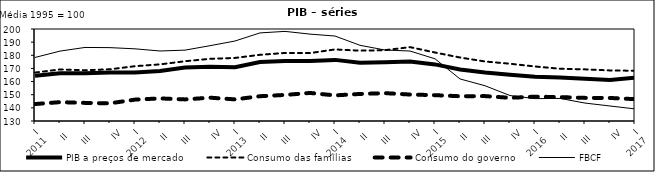
| Category | PIB a preços de mercado | Consumo das famílias | Consumo do governo | FBCF |
|---|---|---|---|---|
| I
2011 | 164.361 | 166.853 | 142.905 | 178.343 |
| II | 166.376 | 169.223 | 144.342 | 183.179 |
| III  | 166.392 | 168.626 | 143.777 | 185.966 |
| IV | 166.932 | 169.352 | 143.451 | 185.827 |
| I
2012 | 166.876 | 171.703 | 146.265 | 184.912 |
| II | 168.067 | 173.083 | 147.182 | 183.265 |
| III  | 170.736 | 175.463 | 146.426 | 183.92 |
| IV | 171.184 | 177.309 | 147.738 | 187.298 |
| I
2013 | 170.969 | 177.988 | 146.456 | 190.869 |
| II | 174.894 | 180.367 | 148.861 | 197.032 |
| III  | 175.668 | 181.774 | 149.842 | 198.182 |
| IV | 175.699 | 181.665 | 151.345 | 196.11 |
| I
2014 | 176.502 | 184.453 | 149.49 | 194.643 |
| II | 174.26 | 183.526 | 150.577 | 187.591 |
| III  | 174.699 | 183.899 | 151.193 | 184 |
| IV | 175.283 | 186.204 | 150.14 | 183.239 |
| I
2015 | 173.072 | 182.126 | 149.655 | 177.321 |
| II | 169.135 | 178.309 | 148.841 | 161.992 |
| III  | 166.838 | 175.269 | 148.946 | 156.824 |
| IV | 165.254 | 173.566 | 147.64 | 149.371 |
| I
2016 | 163.589 | 171.486 | 148.523 | 147.027 |
| II | 163.062 | 169.754 | 148.169 | 147.184 |
| III  | 162.118 | 169.294 | 147.591 | 143.642 |
| IV | 161.229 | 168.477 | 147.531 | 141.415 |
| I
2017 | 162.917 | 168.231 | 146.615 | 139.196 |